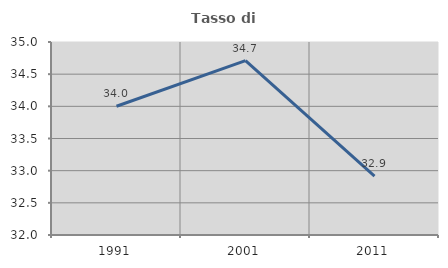
| Category | Tasso di occupazione   |
|---|---|
| 1991.0 | 34.002 |
| 2001.0 | 34.711 |
| 2011.0 | 32.916 |